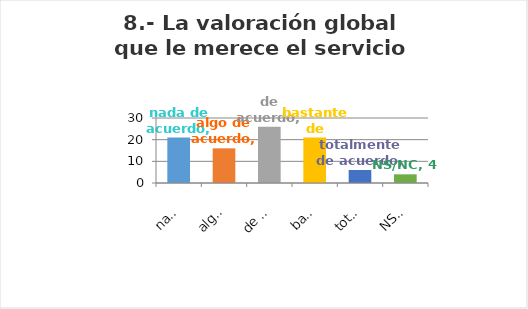
| Category | Series 0 |
|---|---|
| nada de acuerdo | 21 |
| algo de acuerdo | 16 |
| de acuerdo | 26 |
| bastante de acuerdo | 21 |
| totalmente de acuerdo | 6 |
| NS/NC | 4 |